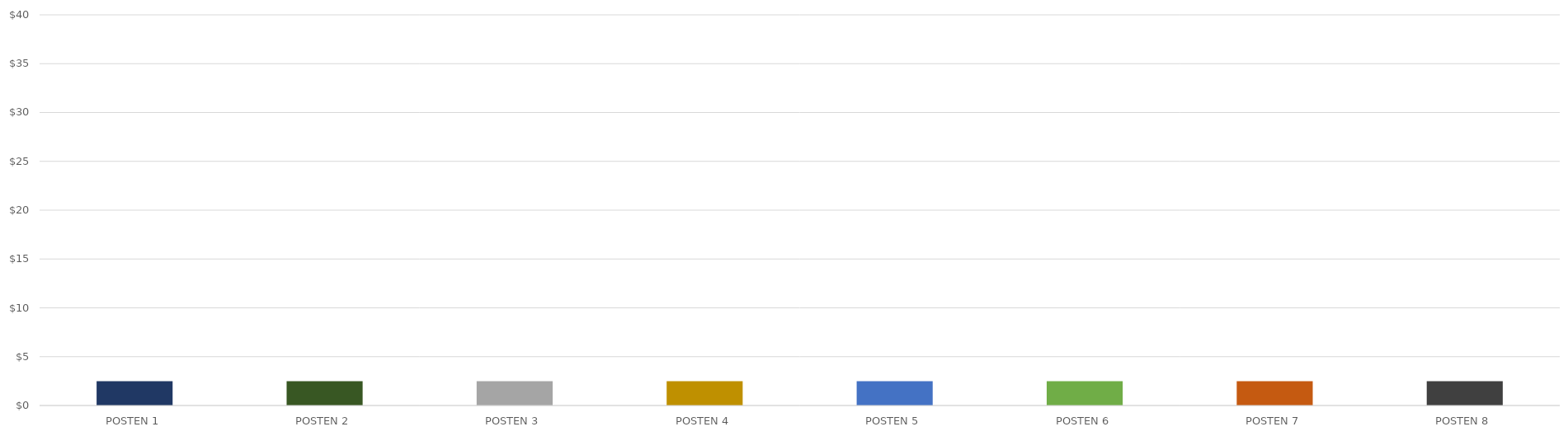
| Category | GEWINN PRO ELEMENT |
|---|---|
| POSTEN 1 | 2.5 |
| POSTEN 2 | 2.5 |
| POSTEN 3 | 2.5 |
| POSTEN 4 | 2.5 |
| POSTEN 5 | 2.5 |
| POSTEN 6 | 2.5 |
| POSTEN 7 | 2.5 |
| POSTEN 8 | 2.5 |